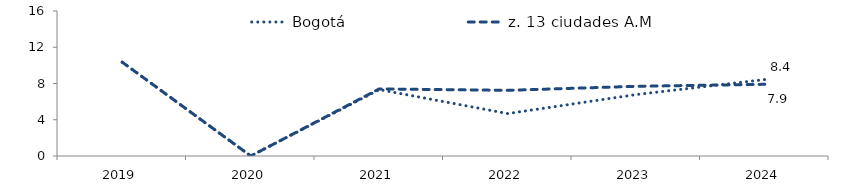
| Category | Bogotá | z. 13 ciudades A.M |
|---|---|---|
| 2019.0 | 10.346 | 10.354 |
| 2020.0 | 0 | 0 |
| 2021.0 | 7.328 | 7.404 |
| 2022.0 | 4.681 | 7.245 |
| 2023.0 | 6.78 | 7.69 |
| 2024.0 | 8.433 | 7.91 |